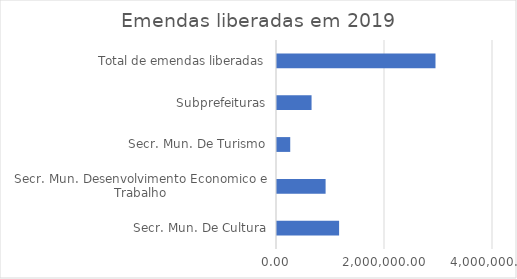
| Category | Series 0 |
|---|---|
| Secr. Mun. De Cultura | 1150000 |
| Secr. Mun. Desenvolvimento Economico e Trabalho | 900000 |
| Secr. Mun. De Turismo | 245000 |
| Subprefeituras | 640000 |
| Total de emendas liberadas | 2935000 |